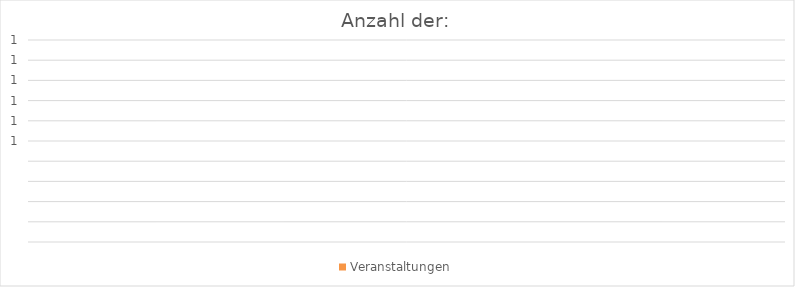
| Category | Veranstaltungen |
|---|---|
| 0 | 0 |